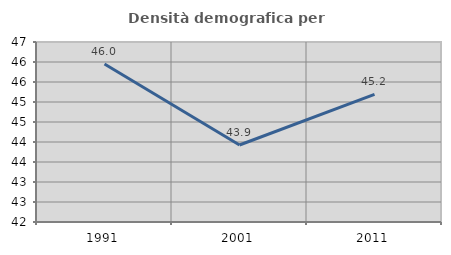
| Category | Densità demografica |
|---|---|
| 1991.0 | 45.951 |
| 2001.0 | 43.925 |
| 2011.0 | 45.191 |